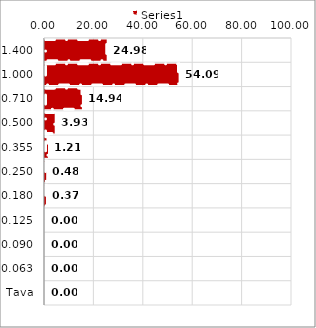
| Category | Series 0 |
|---|---|
| 1,400 | 24.976 |
| 1,000 | 54.093 |
| 0,710 | 14.943 |
| 0,500 | 3.928 |
| 0,355 | 1.206 |
| 0,250 | 0.48 |
| 0,180 | 0.374 |
| 0,125 | 0 |
| 0,090 | 0 |
| 0,063 | 0 |
| Tava | 0 |